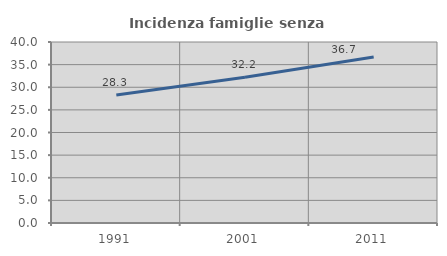
| Category | Incidenza famiglie senza nuclei |
|---|---|
| 1991.0 | 28.311 |
| 2001.0 | 32.198 |
| 2011.0 | 36.704 |